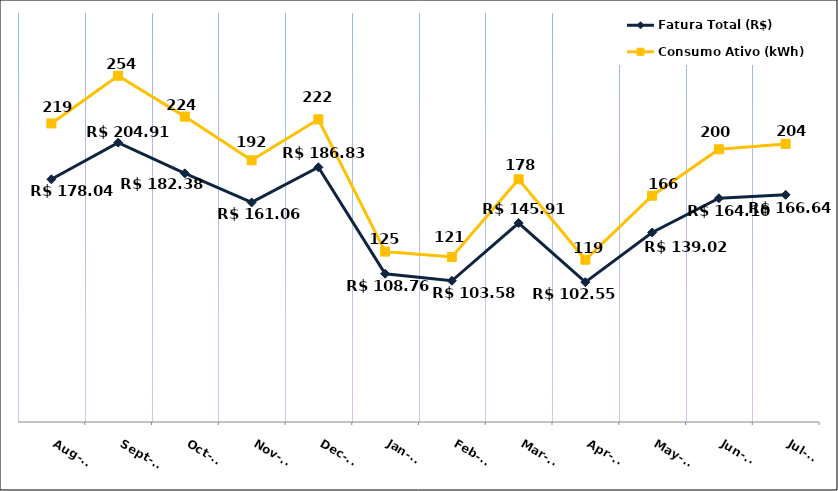
| Category | Fatura Total (R$) |
|---|---|
| 2023-08-01 | 178.04 |
| 2023-09-01 | 204.91 |
| 2023-10-01 | 182.38 |
| 2023-11-01 | 161.06 |
| 2023-12-01 | 186.83 |
| 2024-01-01 | 108.76 |
| 2024-02-01 | 103.58 |
| 2024-03-01 | 145.91 |
| 2024-04-01 | 102.55 |
| 2024-05-01 | 139.02 |
| 2024-06-01 | 164.1 |
| 2024-07-01 | 166.64 |